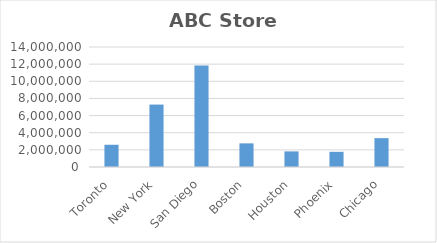
| Category |  Revenue  |
|---|---|
| Toronto | 2594204 |
| New York | 7281427 |
| San Diego | 11827552 |
| Boston | 2758221 |
| Houston | 1822421 |
| Phoenix | 1772281 |
| Chicago | 3366321 |